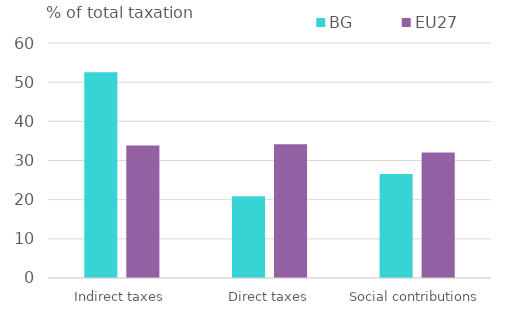
| Category | BG | EU27 |
|---|---|---|
| Indirect taxes | 52.55 | 33.811 |
| Direct taxes | 20.889 | 34.133 |
| Social contributions | 26.561 | 32.056 |